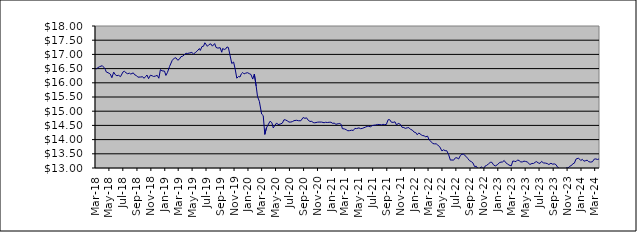
| Category | Series 0 |
|---|---|
| 2014-01-09 | 15.193 |
| 2014-01-17 | 15.231 |
| 2014-01-23 | 15.241 |
| 2014-01-31 | 15.301 |
| 2014-02-10 | 15.36 |
| 2014-02-14 | 15.362 |
| 2014-02-20 | 15.408 |
| 2014-02-28 | 15.432 |
| 2014-03-10 | 15.454 |
| 2014-03-14 | 15.502 |
| 2014-03-20 | 15.505 |
| 2014-03-26 | 15.466 |
| 2014-03-31 | 15.48 |
| 2014-04-09 | 15.541 |
| 2014-04-15 | 15.571 |
| 2014-04-24 | 15.573 |
| 2014-04-30 | 15.574 |
| 2014-05-08 | 15.673 |
| 2014-05-16 | 15.671 |
| 2014-05-22 | 15.656 |
| 2014-05-31 | 15.708 |
| 2014-06-09 | 15.667 |
| 2014-06-16 | 15.692 |
| 2014-06-20 | 15.717 |
| 2014-06-30 | 15.765 |
| 2014-07-09 | 15.765 |
| 2014-07-15 | 15.772 |
| 2014-07-22 | 15.79 |
| 2014-07-31 | 15.746 |
| 2014-08-11 | 15.785 |
| 2014-08-14 | 15.77 |
| 2014-08-21 | 15.765 |
| 2014-08-30 | 15.783 |
| 2014-09-08 | 15.703 |
| 2014-09-16 | 15.599 |
| 2014-09-23 | 15.56 |
| 2014-09-30 | 15.523 |
| 2014-10-09 | 15.576 |
| 2014-10-16 | 15.623 |
| 2014-10-23 | 15.601 |
| 2014-10-31 | 15.569 |
| 2014-11-10 | 15.429 |
| 2014-11-13 | 15.453 |
| 2014-11-20 | 15.416 |
| 2014-11-29 | 15.453 |
| 2014-12-10 | 15.441 |
| 2014-12-18 | 15.405 |
| 2014-12-23 | 15.384 |
| 2014-12-30 | 15.366 |
| 2015-01-08 | 15.346 |
| 2015-01-15 | 15.395 |
| 2015-01-30 | 15.412 |
| 2015-02-10 | 15.388 |
| 2015-02-16 | 15.373 |
| 2015-02-19 | 15.362 |
| 2015-02-28 | 15.417 |
| 2015-03-10 | 15.386 |
| 2015-03-13 | 15.43 |
| 2015-03-19 | 15.46 |
| 2015-03-27 | 15.467 |
| 2015-04-07 | 15.504 |
| 2015-04-16 | 15.55 |
| 2015-04-27 | 15.503 |
| 2015-05-08 | 15.359 |
| 2015-05-14 | 15.339 |
| 2015-05-21 | 15.37 |
| 2015-05-27 | 15.4 |
| 2015-06-03 | 15.368 |
| 2015-06-09 | 15.29 |
| 2015-06-15 | 15.288 |
| 2015-06-22 | 15.308 |
| 2015-06-26 | 15.289 |
| 2015-07-02 | 15.276 |
| 2015-07-09 | 15.349 |
| 2015-07-14 | 15.304 |
| 2015-07-23 | 15.379 |
| 2015-07-29 | 15.406 |
| 2015-08-06 | 15.396 |
| 2015-08-13 | 15.458 |
| 2015-08-20 | 15.434 |
| 2015-08-27 | 15.364 |
| 2015-09-03 | 15.348 |
| 2015-09-09 | 15.382 |
| 2015-09-15 | 15.398 |
| 2015-09-21 | 15.359 |
| 2015-09-28 | 15.39 |
| 2015-10-07 | 15.403 |
| 2015-10-13 | 15.423 |
| 2015-10-22 | 15.457 |
| 2015-10-28 | 15.522 |
| 2015-11-04 | 15.453 |
| 2015-11-13 | 15.367 |
| 2015-11-19 | 15.379 |
| 2015-11-27 | 15.39 |
| 2015-12-03 | 15.438 |
| 2015-12-10 | 15.408 |
| 2015-12-15 | 15.401 |
| 2015-12-23 | 15.407 |
| 2015-12-29 | 15.407 |
| 2016-01-07 | 15.448 |
| 2016-01-14 | 15.441 |
| 2016-01-21 | 15.414 |
| 2016-01-28 | 15.463 |
| 2016-02-04 | 15.526 |
| 2016-02-11 | 15.544 |
| 2016-02-18 | 15.553 |
| 2016-02-25 | 15.629 |
| 2016-03-03 | 15.622 |
| 2016-03-10 | 15.628 |
| 2016-03-16 | 15.637 |
| 2016-03-29 | 15.67 |
| 2016-04-07 | 15.744 |
| 2016-04-14 | 15.749 |
| 2016-04-28 | 15.7 |
| 2016-05-05 | 15.765 |
| 2016-05-12 | 15.805 |
| 2016-05-19 | 15.898 |
| 2016-05-30 | 15.934 |
| 2016-06-03 | 15.949 |
| 2016-06-09 | 16.018 |
| 2016-06-15 | 16.039 |
| 2016-06-23 | 15.985 |
| 2016-06-29 | 16.088 |
| 2016-07-11 | 16.216 |
| 2016-07-14 | 16.217 |
| 2016-07-21 | 16.191 |
| 2016-07-28 | 16.236 |
| 2016-08-04 | 16.22 |
| 2016-08-11 | 16.247 |
| 2016-08-16 | 16.257 |
| 2016-08-24 | 16.289 |
| 2016-08-30 | 16.281 |
| 2016-09-08 | 16.282 |
| 2016-09-15 | 16.139 |
| 2016-09-22 | 16.188 |
| 2016-09-29 | 16.298 |
| 2016-10-06 | 16.226 |
| 2016-10-13 | 16.178 |
| 2016-10-20 | 16.198 |
| 2016-10-28 | 16.143 |
| 2016-11-03 | 16.17 |
| 2016-11-10 | 16.128 |
| 2016-11-15 | 15.948 |
| 2016-11-23 | 15.965 |
| 2016-11-29 | 15.969 |
| 2016-12-07 | 15.974 |
| 2016-12-14 | 15.987 |
| 2016-12-21 | 15.998 |
| 2016-12-28 | 16.041 |
| 2017-01-05 | 16.071 |
| 2017-01-16 | 16.13 |
| 2017-01-23 | 16.104 |
| 2017-01-30 | 16.102 |
| 2017-02-06 | 16.131 |
| 2017-02-13 | 16.18 |
| 2017-02-20 | 16.197 |
| 2017-02-27 | 16.274 |
| 2017-03-06 | 16.219 |
| 2017-03-13 | 16.159 |
| 2017-03-20 | 16.218 |
| 2017-03-27 | 16.286 |
| 2017-03-30 | 16.326 |
| 2017-04-10 | 16.379 |
| 2017-04-18 | 16.431 |
| 2017-04-24 | 16.423 |
| 2017-04-28 | 16.408 |
| 2017-05-08 | 16.391 |
| 2017-05-15 | 16.4 |
| 2017-05-22 | 16.378 |
| 2017-05-30 | 16.419 |
| 2017-06-06 | 16.456 |
| 2017-06-12 | 16.457 |
| 2017-06-15 | 16.49 |
| 2017-06-20 | 16.485 |
| 2017-06-29 | 16.448 |
| 2017-07-04 | 16.374 |
| 2017-07-10 | 16.302 |
| 2017-07-14 | 16.341 |
| 2017-07-19 | 16.389 |
| 2017-07-24 | 16.417 |
| 2017-07-28 | 16.41 |
| 2017-08-03 | 16.45 |
| 2017-08-09 | 16.454 |
| 2017-08-14 | 16.475 |
| 2017-08-21 | 16.474 |
| 2017-08-24 | 16.48 |
| 2017-08-30 | 16.488 |
| 2017-09-07 | 16.512 |
| 2017-09-14 | 16.491 |
| 2017-09-20 | 16.487 |
| 2017-09-29 | 16.449 |
| 2017-10-05 | 16.484 |
| 2017-10-11 | 16.486 |
| 2017-10-16 | 16.52 |
| 2017-10-23 | 16.492 |
| 2017-10-30 | 16.466 |
| 2017-11-07 | 16.319 |
| 2017-11-15 | 16.268 |
| 2017-11-23 | 16.453 |
| 2017-11-29 | 16.434 |
| 2017-12-07 | 16.474 |
| 2017-12-13 | 16.455 |
| 2017-12-18 | 16.493 |
| 2017-12-28 | 16.494 |
| 2018-01-08 | 16.556 |
| 2018-01-17 | 16.562 |
| 2018-01-24 | 16.551 |
| 2018-01-30 | 16.531 |
| 2018-02-05 | 16.487 |
| 2018-02-13 | 16.458 |
| 2018-02-19 | 16.393 |
| 2018-02-27 | 16.431 |
| 2018-03-07 | 16.433 |
| 2018-03-14 | 16.482 |
| 2018-03-21 | 16.531 |
| 2018-03-29 | 16.568 |
| 2018-04-10 | 16.602 |
| 2018-04-16 | 16.552 |
| 2018-04-23 | 16.475 |
| 2018-04-27 | 16.386 |
| 2018-05-10 | 16.335 |
| 2018-05-15 | 16.307 |
| 2018-05-22 | 16.18 |
| 2018-05-30 | 16.376 |
| 2018-06-06 | 16.284 |
| 2018-06-13 | 16.249 |
| 2018-06-20 | 16.264 |
| 2018-06-29 | 16.217 |
| 2018-07-10 | 16.385 |
| 2018-07-16 | 16.405 |
| 2018-07-23 | 16.352 |
| 2018-07-30 | 16.32 |
| 2018-08-07 | 16.339 |
| 2018-08-13 | 16.308 |
| 2018-08-24 | 16.349 |
| 2018-08-30 | 16.281 |
| 2018-09-06 | 16.26 |
| 2018-09-13 | 16.199 |
| 2018-09-24 | 16.203 |
| 2018-09-28 | 16.193 |
| 2018-10-04 | 16.213 |
| 2018-10-10 | 16.157 |
| 2018-10-16 | 16.21 |
| 2018-10-23 | 16.274 |
| 2018-10-30 | 16.145 |
| 2018-11-07 | 16.267 |
| 2018-11-15 | 16.246 |
| 2018-11-21 | 16.223 |
| 2018-11-29 | 16.237 |
| 2018-12-07 | 16.262 |
| 2018-12-14 | 16.161 |
| 2018-12-21 | 16.465 |
| 2018-12-28 | 16.422 |
| 2019-01-08 | 16.412 |
| 2019-01-14 | 16.259 |
| 2019-01-21 | 16.366 |
| 2019-01-30 | 16.572 |
| 2019-02-11 | 16.793 |
| 2019-02-14 | 16.811 |
| 2019-02-21 | 16.874 |
| 2019-02-27 | 16.879 |
| 2019-03-07 | 16.795 |
| 2019-03-14 | 16.83 |
| 2019-03-21 | 16.919 |
| 2019-03-29 | 16.938 |
| 2019-04-04 | 16.98 |
| 2019-04-12 | 17.041 |
| 2019-04-18 | 17.032 |
| 2019-04-29 | 17.052 |
| 2019-05-08 | 17.068 |
| 2019-05-15 | 17.014 |
| 2019-05-23 | 17.063 |
| 2019-05-30 | 17.11 |
| 2019-06-10 | 17.206 |
| 2019-06-14 | 17.14 |
| 2019-06-21 | 17.275 |
| 2019-06-28 | 17.287 |
| 2019-07-04 | 17.41 |
| 2019-07-15 | 17.285 |
| 2019-07-22 | 17.347 |
| 2019-07-30 | 17.372 |
| 2019-08-06 | 17.291 |
| 2019-08-16 | 17.381 |
| 2019-08-22 | 17.245 |
| 2019-08-30 | 17.221 |
| 2019-09-09 | 17.236 |
| 2019-09-16 | 17.076 |
| 2019-09-20 | 17.208 |
| 2019-09-27 | 17.173 |
| 2019-10-03 | 17.189 |
| 2019-10-09 | 17.262 |
| 2019-10-15 | 17.245 |
| 2019-10-30 | 16.679 |
| 2019-11-07 | 16.73 |
| 2019-11-14 | 16.481 |
| 2019-11-21 | 16.162 |
| 2019-11-29 | 16.224 |
| 2019-12-05 | 16.204 |
| 2019-12-11 | 16.316 |
| 2019-12-17 | 16.363 |
| 2019-12-23 | 16.313 |
| 2019-12-30 | 16.339 |
| 2020-01-07 | 16.356 |
| 2020-01-15 | 16.322 |
| 2020-01-22 | 16.294 |
| 2020-01-30 | 16.131 |
| 2020-02-06 | 16.307 |
| 2020-02-14 | 15.886 |
| 2020-02-20 | 15.516 |
| 2020-02-28 | 15.347 |
| 2020-03-09 | 14.899 |
| 2020-03-16 | 14.845 |
| 2020-03-23 | 14.183 |
| 2020-03-30 | 14.408 |
| 2020-04-06 | 14.516 |
| 2020-04-15 | 14.647 |
| 2020-04-23 | 14.595 |
| 2020-04-29 | 14.411 |
| 2020-05-06 | 14.498 |
| 2020-05-14 | 14.587 |
| 2020-05-20 | 14.527 |
| 2020-05-29 | 14.544 |
| 2020-06-08 | 14.58 |
| 2020-06-15 | 14.699 |
| 2020-06-22 | 14.692 |
| 2020-06-29 | 14.664 |
| 2020-07-07 | 14.618 |
| 2020-07-15 | 14.618 |
| 2020-07-22 | 14.633 |
| 2020-07-29 | 14.668 |
| 2020-08-10 | 14.681 |
| 2020-08-17 | 14.665 |
| 2020-08-21 | 14.671 |
| 2020-08-28 | 14.664 |
| 2020-09-07 | 14.778 |
| 2020-09-15 | 14.748 |
| 2020-09-22 | 14.767 |
| 2020-09-29 | 14.685 |
| 2020-10-07 | 14.639 |
| 2020-10-15 | 14.643 |
| 2020-10-21 | 14.601 |
| 2020-10-28 | 14.591 |
| 2020-11-10 | 14.614 |
| 2020-11-16 | 14.617 |
| 2020-11-20 | 14.629 |
| 2020-11-27 | 14.617 |
| 2020-12-08 | 14.594 |
| 2020-12-15 | 14.611 |
| 2020-12-22 | 14.601 |
| 2020-12-30 | 14.61 |
| 2021-01-07 | 14.612 |
| 2021-01-15 | 14.57 |
| 2021-01-21 | 14.583 |
| 2021-01-29 | 14.538 |
| 2021-02-08 | 14.559 |
| 2021-02-15 | 14.565 |
| 2021-02-22 | 14.526 |
| 2021-02-26 | 14.386 |
| 2021-03-08 | 14.375 |
| 2021-03-15 | 14.348 |
| 2021-03-22 | 14.311 |
| 2021-03-30 | 14.315 |
| 2021-04-08 | 14.332 |
| 2021-04-15 | 14.32 |
| 2021-04-22 | 14.395 |
| 2021-04-29 | 14.388 |
| 2021-05-10 | 14.412 |
| 2021-05-17 | 14.384 |
| 2021-05-24 | 14.393 |
| 2021-05-28 | 14.426 |
| 2021-06-07 | 14.438 |
| 2021-06-15 | 14.465 |
| 2021-06-22 | 14.468 |
| 2021-06-29 | 14.45 |
| 2021-07-07 | 14.492 |
| 2021-07-15 | 14.507 |
| 2021-07-23 | 14.514 |
| 2021-07-30 | 14.533 |
| 2021-08-10 | 14.528 |
| 2021-08-17 | 14.519 |
| 2021-08-23 | 14.538 |
| 2021-08-30 | 14.53 |
| 2021-09-07 | 14.532 |
| 2021-09-15 | 14.702 |
| 2021-09-22 | 14.701 |
| 2021-09-29 | 14.614 |
| 2021-10-07 | 14.607 |
| 2021-10-15 | 14.626 |
| 2021-10-22 | 14.509 |
| 2021-10-29 | 14.575 |
| 2021-11-08 | 14.535 |
| 2021-11-15 | 14.434 |
| 2021-11-23 | 14.426 |
| 2021-11-29 | 14.394 |
| 2021-12-08 | 14.416 |
| 2021-12-15 | 14.422 |
| 2021-12-22 | 14.36 |
| 2021-12-30 | 14.336 |
| 2022-01-07 | 14.263 |
| 2022-01-14 | 14.249 |
| 2022-01-20 | 14.172 |
| 2022-01-28 | 14.233 |
| 2022-02-07 | 14.169 |
| 2022-02-14 | 14.139 |
| 2022-02-21 | 14.136 |
| 2022-02-25 | 14.096 |
| 2022-03-07 | 14.122 |
| 2022-03-14 | 13.987 |
| 2022-03-21 | 13.943 |
| 2022-03-30 | 13.86 |
| 2022-04-07 | 13.85 |
| 2022-04-14 | 13.851 |
| 2022-04-21 | 13.803 |
| 2022-04-29 | 13.751 |
| 2022-05-09 | 13.6 |
| 2022-05-16 | 13.641 |
| 2022-05-23 | 13.61 |
| 2022-05-30 | 13.609 |
| 2022-06-07 | 13.478 |
| 2022-06-15 | 13.278 |
| 2022-06-22 | 13.283 |
| 2022-06-29 | 13.275 |
| 2022-07-07 | 13.358 |
| 2022-07-14 | 13.359 |
| 2022-07-21 | 13.317 |
| 2022-07-29 | 13.44 |
| 2022-08-05 | 13.486 |
| 2022-08-12 | 13.482 |
| 2022-08-22 | 13.413 |
| 2022-08-30 | 13.339 |
| 2022-09-07 | 13.258 |
| 2022-09-15 | 13.224 |
| 2022-09-22 | 13.178 |
| 2022-09-29 | 13.054 |
| 2022-10-07 | 13.06 |
| 2022-10-13 | 12.986 |
| 2022-10-20 | 12.966 |
| 2022-10-28 | 13.042 |
| 2022-11-07 | 12.975 |
| 2022-11-14 | 13.063 |
| 2022-11-21 | 13.092 |
| 2022-11-29 | 13.142 |
| 2022-12-07 | 13.199 |
| 2022-12-14 | 13.2 |
| 2022-12-21 | 13.112 |
| 2022-12-29 | 13.072 |
| 2023-01-09 | 13.125 |
| 2023-01-16 | 13.189 |
| 2023-01-23 | 13.207 |
| 2023-01-30 | 13.213 |
| 2023-02-06 | 13.265 |
| 2023-02-13 | 13.186 |
| 2023-02-20 | 13.146 |
| 2023-02-27 | 13.105 |
| 2023-03-09 | 13.074 |
| 2023-03-16 | 13.247 |
| 2023-03-23 | 13.237 |
| 2023-03-30 | 13.225 |
| 2023-04-06 | 13.283 |
| 2023-04-13 | 13.259 |
| 2023-04-20 | 13.212 |
| 2023-04-28 | 13.217 |
| 2023-05-04 | 13.243 |
| 2023-05-11 | 13.231 |
| 2023-05-18 | 13.213 |
| 2023-05-30 | 13.124 |
| 2023-06-08 | 13.16 |
| 2023-06-15 | 13.161 |
| 2023-06-22 | 13.202 |
| 2023-06-27 | 13.226 |
| 2023-07-06 | 13.178 |
| 2023-07-13 | 13.161 |
| 2023-07-20 | 13.231 |
| 2023-07-28 | 13.181 |
| 2023-08-07 | 13.171 |
| 2023-08-14 | 13.156 |
| 2023-08-21 | 13.122 |
| 2023-08-30 | 13.167 |
| 2023-09-07 | 13.134 |
| 2023-09-14 | 13.145 |
| 2023-09-21 | 13.12 |
| 2023-09-29 | 13.022 |
| 2023-10-09 | 12.971 |
| 2023-10-16 | 12.973 |
| 2023-10-23 | 12.911 |
| 2023-10-30 | 12.922 |
| 2023-11-06 | 13.007 |
| 2023-11-13 | 12.999 |
| 2023-11-20 | 13.059 |
| 2023-11-29 | 13.093 |
| 2023-12-04 | 13.148 |
| 2023-12-11 | 13.172 |
| 2023-12-18 | 13.313 |
| 2023-12-29 | 13.349 |
| 2024-01-08 | 13.265 |
| 2024-01-15 | 13.304 |
| 2024-01-22 | 13.24 |
| 2024-01-30 | 13.26 |
| 2024-02-05 | 13.275 |
| 2024-02-12 | 13.223 |
| 2024-02-19 | 13.208 |
| 2024-02-28 | 13.217 |
| 2024-03-07 | 13.313 |
| 2024-03-14 | 13.321 |
| 2024-03-21 | 13.3 |
| 2024-03-28 | 13.318 |